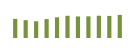
| Category | Saldo [ (1)-(2) ] |
|---|---|
| 0 | 532729.955 |
| 1 | 495602.949 |
| 2 | 464912.543 |
| 3 | 524886.84 |
| 4 | 575003.691 |
| 5 | 617133.535 |
| 6 | 598394.561 |
| 7 | 601130.812 |
| 8 | 618778.996 |
| 9 | 613479.503 |
| 10 | 641913.051 |